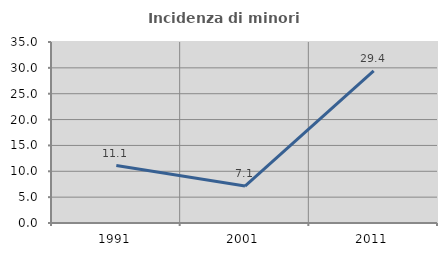
| Category | Incidenza di minori stranieri |
|---|---|
| 1991.0 | 11.111 |
| 2001.0 | 7.143 |
| 2011.0 | 29.412 |